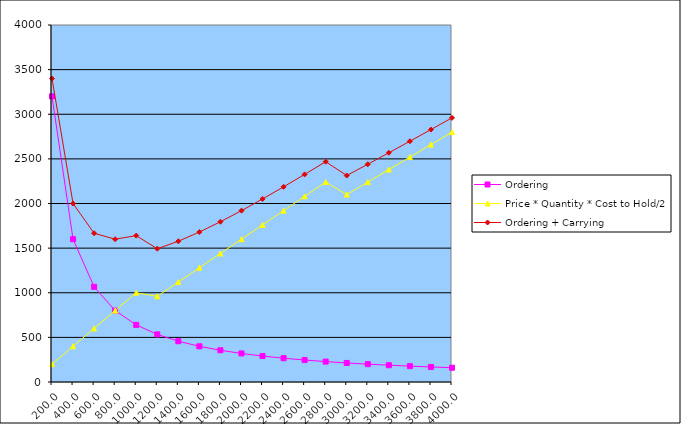
| Category | Ordering | Price * Quantity * Cost to Hold/2 | Ordering + Carrying |
|---|---|---|---|
| 200.0 | 3200 | 200 | 3400 |
| 400.0 | 1600 | 400 | 2000 |
| 600.0 | 1066.667 | 600 | 1666.667 |
| 800.0 | 800 | 800 | 1600 |
| 1000.0 | 640 | 1000 | 1640 |
| 1200.0 | 533.333 | 960 | 1493.333 |
| 1400.0 | 457.143 | 1120 | 1577.143 |
| 1600.0 | 400 | 1280 | 1680 |
| 1800.0 | 355.556 | 1440 | 1795.556 |
| 2000.0 | 320 | 1600 | 1920 |
| 2200.0 | 290.909 | 1760 | 2050.909 |
| 2400.0 | 266.667 | 1920 | 2186.667 |
| 2600.0 | 246.154 | 2080 | 2326.154 |
| 2800.0 | 228.571 | 2240 | 2468.571 |
| 3000.0 | 213.333 | 2100 | 2313.333 |
| 3200.0 | 200 | 2240 | 2440 |
| 3400.0 | 188.235 | 2380 | 2568.235 |
| 3600.0 | 177.778 | 2520 | 2697.778 |
| 3800.0 | 168.421 | 2660 | 2828.421 |
| 4000.0 | 160 | 2800 | 2960 |